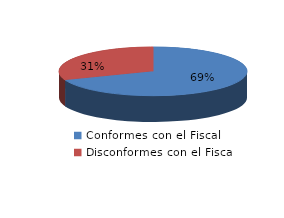
| Category | Series 0 |
|---|---|
| 0 | 452 |
| 1 | 202 |